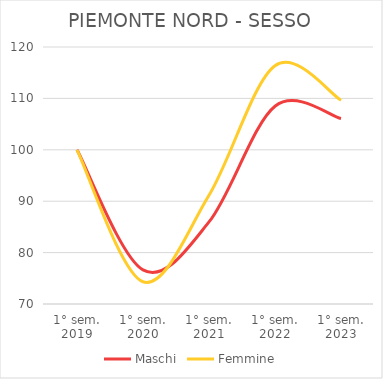
| Category | Maschi | Femmine |
|---|---|---|
| 1° sem.
2019 | 100 | 100 |
| 1° sem.
2020 | 76.63 | 74.331 |
| 1° sem.
2021 | 85.967 | 91.156 |
| 1° sem.
2022 | 108.473 | 116.36 |
| 1° sem.
2023 | 106.075 | 109.647 |